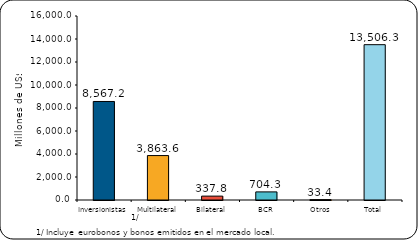
| Category | Series 1 |
|---|---|
| Inversionistas | 8567.2 |
| Multilateral | 3863.6 |
| Bilateral | 337.8 |
| BCR | 704.3 |
| Otros | 33.4 |
| Total | 13506.3 |